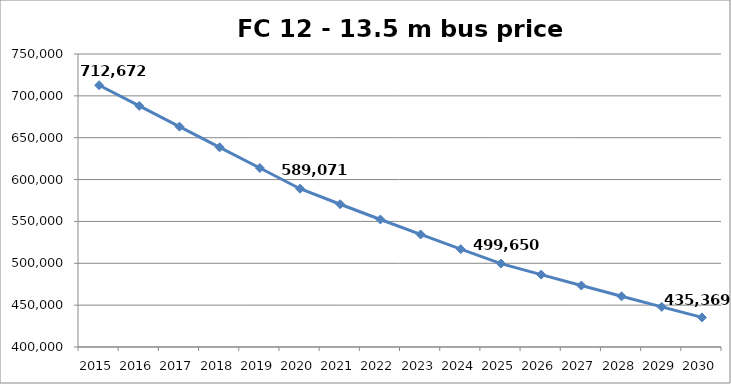
| Category | FC bus price |
|---|---|
| 2015.0 | 712672 |
| 2016.0 | 687951.829 |
| 2017.0 | 663231.658 |
| 2018.0 | 638511.487 |
| 2019.0 | 613791.317 |
| 2020.0 | 589071.146 |
| 2021.0 | 570522.827 |
| 2022.0 | 552306.59 |
| 2023.0 | 534422.436 |
| 2024.0 | 516870.365 |
| 2025.0 | 499650.376 |
| 2026.0 | 486456.704 |
| 2027.0 | 473431.772 |
| 2028.0 | 460575.581 |
| 2029.0 | 447888.13 |
| 2030.0 | 435369.42 |